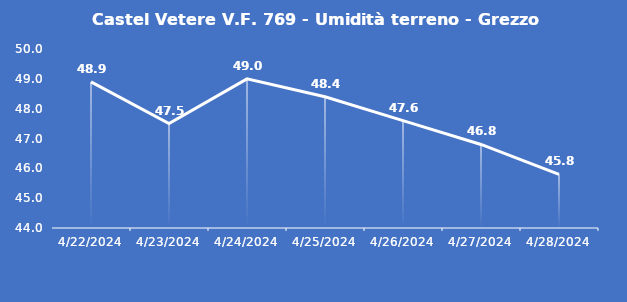
| Category | Castel Vetere V.F. 769 - Umidità terreno - Grezzo (%VWC) |
|---|---|
| 4/22/24 | 48.9 |
| 4/23/24 | 47.5 |
| 4/24/24 | 49 |
| 4/25/24 | 48.4 |
| 4/26/24 | 47.6 |
| 4/27/24 | 46.8 |
| 4/28/24 | 45.8 |